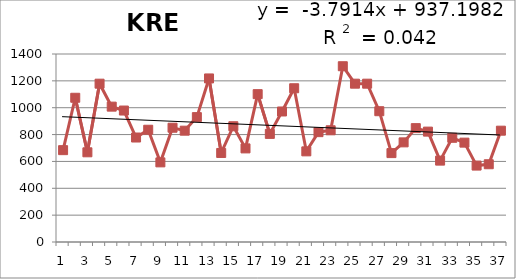
| Category | 1976-2012 |
|---|---|
| 0 | 684 |
| 1 | 1074 |
| 2 | 668 |
| 3 | 1179 |
| 4 | 1008 |
| 5 | 979 |
| 6 | 778 |
| 7 | 836 |
| 8 | 593 |
| 9 | 851 |
| 10 | 829 |
| 11 | 930 |
| 12 | 1218 |
| 13 | 663 |
| 14 | 862 |
| 15 | 697 |
| 16 | 1101 |
| 17 | 805 |
| 18 | 972 |
| 19 | 1145 |
| 20 | 675 |
| 21 | 818 |
| 22 | 832 |
| 23 | 1309 |
| 24 | 1179 |
| 25 | 1179 |
| 26 | 974 |
| 27 | 662 |
| 28 | 742 |
| 29 | 848 |
| 30 | 822 |
| 31 | 606 |
| 32 | 776 |
| 33 | 740 |
| 34 | 569 |
| 35 | 579 |
| 36 | 829 |